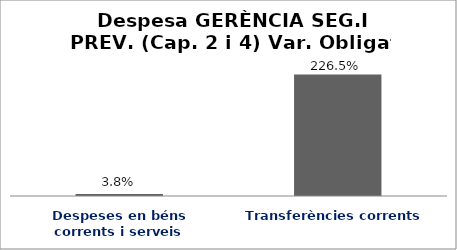
| Category | Series 0 |
|---|---|
| Despeses en béns corrents i serveis | 0.038 |
| Transferències corrents | 2.265 |